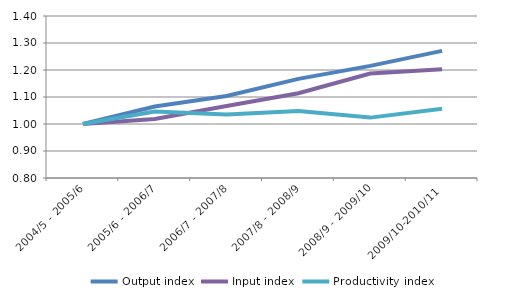
| Category | Output index | Input index | Productivity index |
|---|---|---|---|
| 2004/5 - 2005/6 | 1 | 1 | 1 |
| 2005/6 - 2006/7 | 1.065 | 1.018 | 1.046 |
| 2006/7 - 2007/8 | 1.104 | 1.067 | 1.035 |
| 2007/8 - 2008/9 | 1.167 | 1.114 | 1.048 |
| 2008/9 - 2009/10 | 1.215 | 1.187 | 1.024 |
| 2009/10-2010/11 | 1.271 | 1.203 | 1.056 |